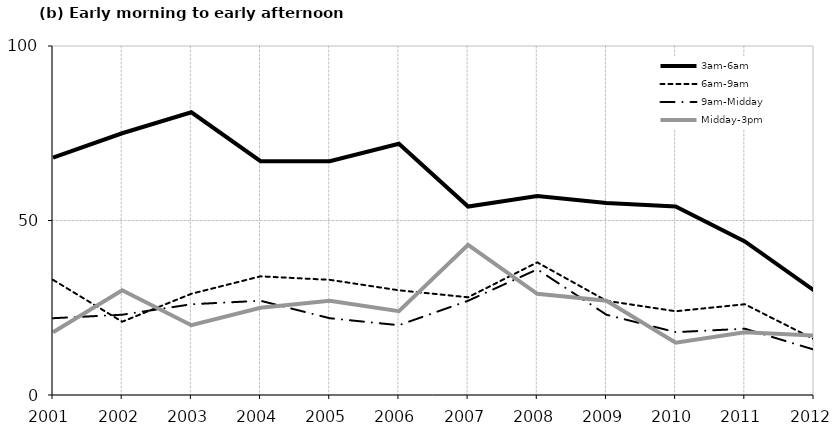
| Category | 3am-6am | 6am-9am | 9am-Midday | Midday-3pm |
|---|---|---|---|---|
| 2001.0 | 68 | 33 | 22 | 18 |
| 2002.0 | 75 | 21 | 23 | 30 |
| 2003.0 | 81 | 29 | 26 | 20 |
| 2004.0 | 67 | 34 | 27 | 25 |
| 2005.0 | 67 | 33 | 22 | 27 |
| 2006.0 | 72 | 30 | 20 | 24 |
| 2007.0 | 54 | 28 | 27 | 43 |
| 2008.0 | 57 | 38 | 36 | 29 |
| 2009.0 | 55 | 27 | 23 | 27 |
| 2010.0 | 54 | 24 | 18 | 15 |
| 2011.0 | 44 | 26 | 19 | 18 |
| 2012.0 | 30 | 16 | 13 | 17 |